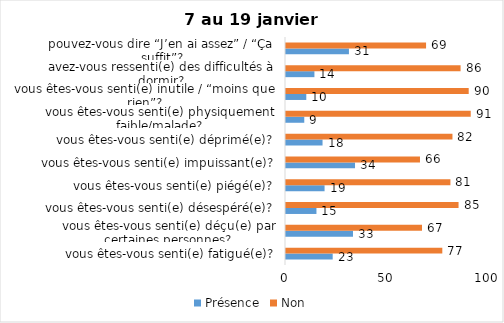
| Category | Présence | Non |
|---|---|---|
| vous êtes-vous senti(e) fatigué(e)? | 23 | 77 |
| vous êtes-vous senti(e) déçu(e) par certaines personnes? | 33 | 67 |
| vous êtes-vous senti(e) désespéré(e)? | 15 | 85 |
| vous êtes-vous senti(e) piégé(e)? | 19 | 81 |
| vous êtes-vous senti(e) impuissant(e)? | 34 | 66 |
| vous êtes-vous senti(e) déprimé(e)? | 18 | 82 |
| vous êtes-vous senti(e) physiquement faible/malade? | 9 | 91 |
| vous êtes-vous senti(e) inutile / “moins que rien”? | 10 | 90 |
| avez-vous ressenti(e) des difficultés à dormir? | 14 | 86 |
| pouvez-vous dire “J’en ai assez” / “Ça suffit”? | 31 | 69 |